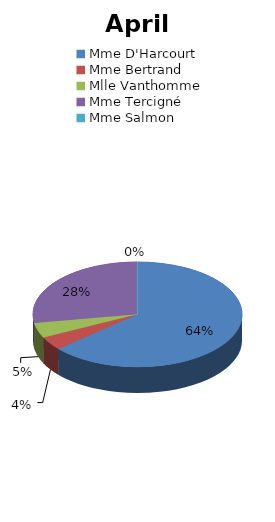
| Category | avril 2013 |
|---|---|
| Mme D'Harcourt | 345 |
| Mme Bertrand | 22.5 |
| Mlle Vanthomme | 25 |
| Mme Tercigné | 150 |
| Mme Salmon | 0 |